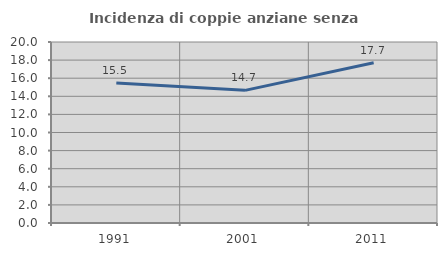
| Category | Incidenza di coppie anziane senza figli  |
|---|---|
| 1991.0 | 15.472 |
| 2001.0 | 14.658 |
| 2011.0 | 17.702 |